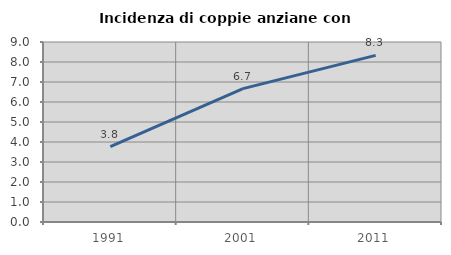
| Category | Incidenza di coppie anziane con figli |
|---|---|
| 1991.0 | 3.774 |
| 2001.0 | 6.667 |
| 2011.0 | 8.333 |